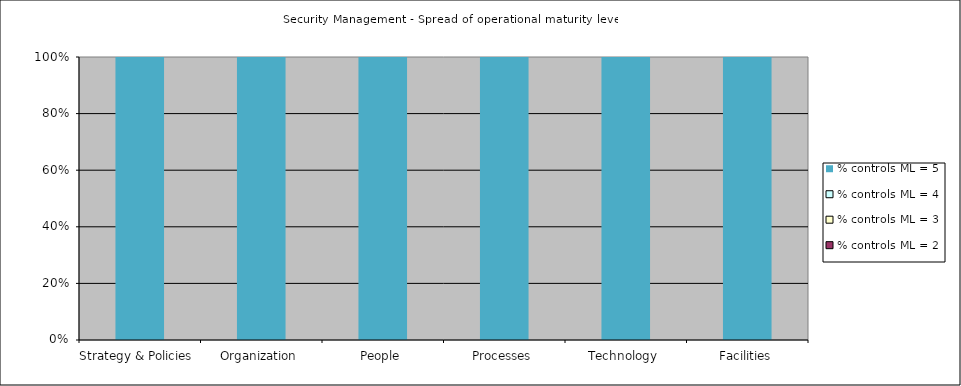
| Category | % controls ML <= 1 | % controls ML = 2 | % controls ML = 3 | % controls ML = 4 | % controls ML = 5 |
|---|---|---|---|---|---|
| Strategy & Policies | 0 | 0 | 0 | 0 | 1 |
| Organization | 0 | 0 | 0 | 0 | 1 |
| People | 0 | 0 | 0 | 0 | 1 |
| Processes | 0 | 0 | 0 | 0 | 1 |
| Technology | 0 | 0 | 0 | 0 | 1 |
| Facilities | 0 | 0 | 0 | 0 | 1 |